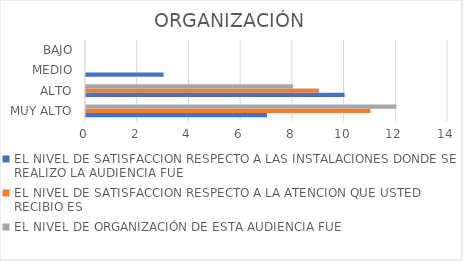
| Category | EL NIVEL DE SATISFACCION RESPECTO A LAS INSTALACIONES DONDE SE REALIZO LA AUDIENCIA FUE | EL NIVEL DE SATISFACCION RESPECTO A LA ATENCION QUE USTED RECIBIO ES | EL NIVEL DE ORGANIZACIÓN DE ESTA AUDIENCIA FUE |
|---|---|---|---|
| MUY ALTO | 7 | 11 | 12 |
| ALTO | 10 | 9 | 8 |
| MEDIO | 3 | 0 | 0 |
| BAJO | 0 | 0 | 0 |